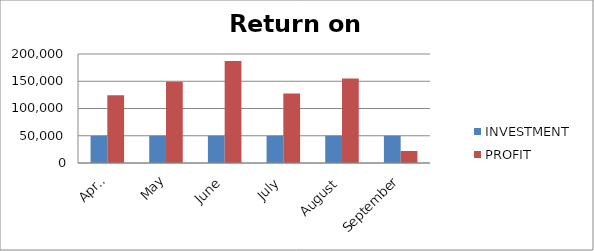
| Category | INVESTMENT  | PROFIT |
|---|---|---|
| April | 50000 | 124447 |
| May | 50000 | 149286 |
| June | 50000 | 187101 |
| July | 50000 | 127679 |
| August | 50000 | 154994 |
| September | 50000 | 21972 |